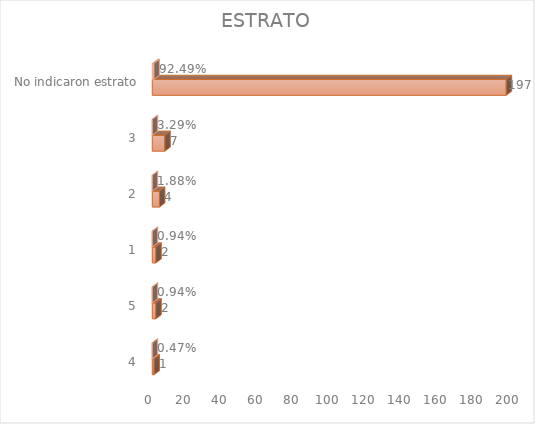
| Category | Cuenta de Número petición | Cuenta de Número petición2 |
|---|---|---|
| 4 | 1 | 0.005 |
| 5 | 2 | 0.009 |
| 1 | 2 | 0.009 |
| 2 | 4 | 0.019 |
| 3 | 7 | 0.033 |
| No indicaron estrato | 197 | 0.925 |